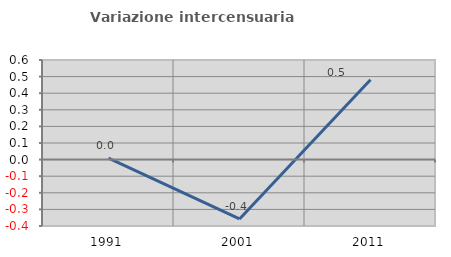
| Category | Variazione intercensuaria annua |
|---|---|
| 1991.0 | 0.009 |
| 2001.0 | -0.357 |
| 2011.0 | 0.481 |